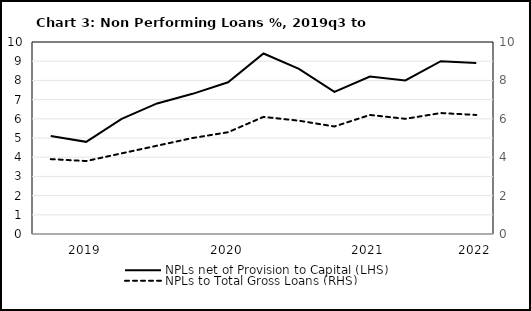
| Category | NPLs net of Provision to Capital (LHS) |
|---|---|
| nan | 5.1 |
| 2019.0 | 4.8 |
| nan | 6 |
| nan | 6.8 |
| nan | 7.3 |
| 2020.0 | 7.9 |
| nan | 9.4 |
| nan | 8.6 |
| nan | 7.4 |
| 2021.0 | 8.2 |
| nan | 8 |
| nan | 9 |
| 2022.0 | 8.9 |